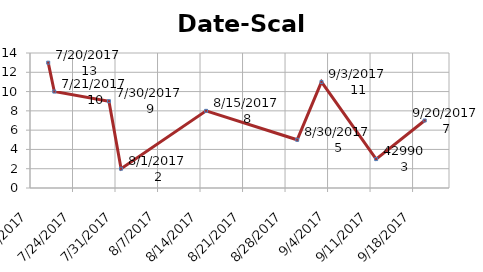
| Category | Menge |
|---|---|
| 7/20/17 | 13 |
| 7/21/17 | 10 |
| 7/30/17 | 9 |
| 8/1/17 | 2 |
| 8/15/17 | 8 |
| nan | 10 |
| 8/30/17 | 5 |
| 9/3/17 | 11 |
| 9/12/17 | 3 |
| 9/20/17 | 7 |